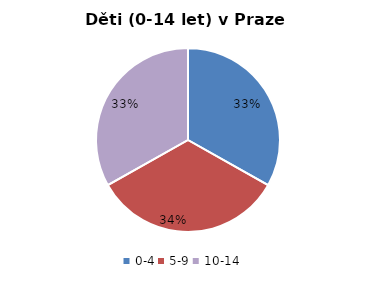
| Category | Series 0 |
|---|---|
| 0-4 | 72645 |
| 5-9 | 73737 |
| 10-14 | 72630 |